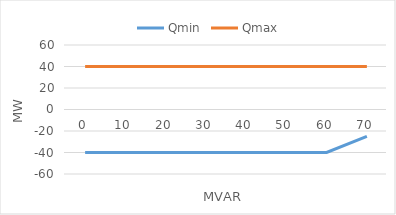
| Category | Qmin | Qmax |
|---|---|---|
| 0.0 | -40 | 40 |
| 10.0 | -40 | 40 |
| 20.0 | -40 | 40 |
| 30.0 | -40 | 40 |
| 40.0 | -40 | 40 |
| 50.0 | -40 | 40 |
| 60.0 | -40 | 40 |
| 70.0 | -25 | 40 |